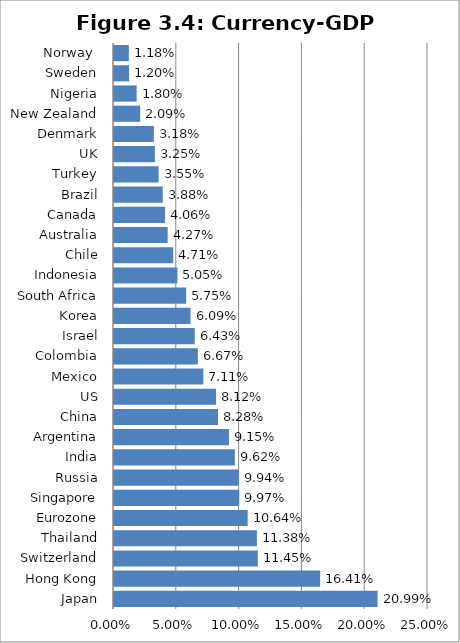
| Category | Currency to GDP Ratio |
|---|---|
| Japan | 0.21 |
| Hong Kong | 0.164 |
| Switzerland | 0.114 |
| Thailand | 0.114 |
| Eurozone | 0.106 |
| Singapore | 0.1 |
| Russia | 0.099 |
| India | 0.096 |
| Argentina | 0.092 |
| China | 0.083 |
| US | 0.081 |
| Mexico | 0.071 |
| Colombia | 0.067 |
| Israel | 0.064 |
| Korea | 0.061 |
| South Africa | 0.057 |
| Indonesia | 0.051 |
| Chile | 0.047 |
| Australia | 0.043 |
| Canada | 0.041 |
| Brazil | 0.039 |
| Turkey | 0.036 |
| UK | 0.033 |
| Denmark | 0.032 |
| New Zealand | 0.021 |
| Nigeria | 0.018 |
| Sweden | 0.012 |
| Norway  | 0.012 |